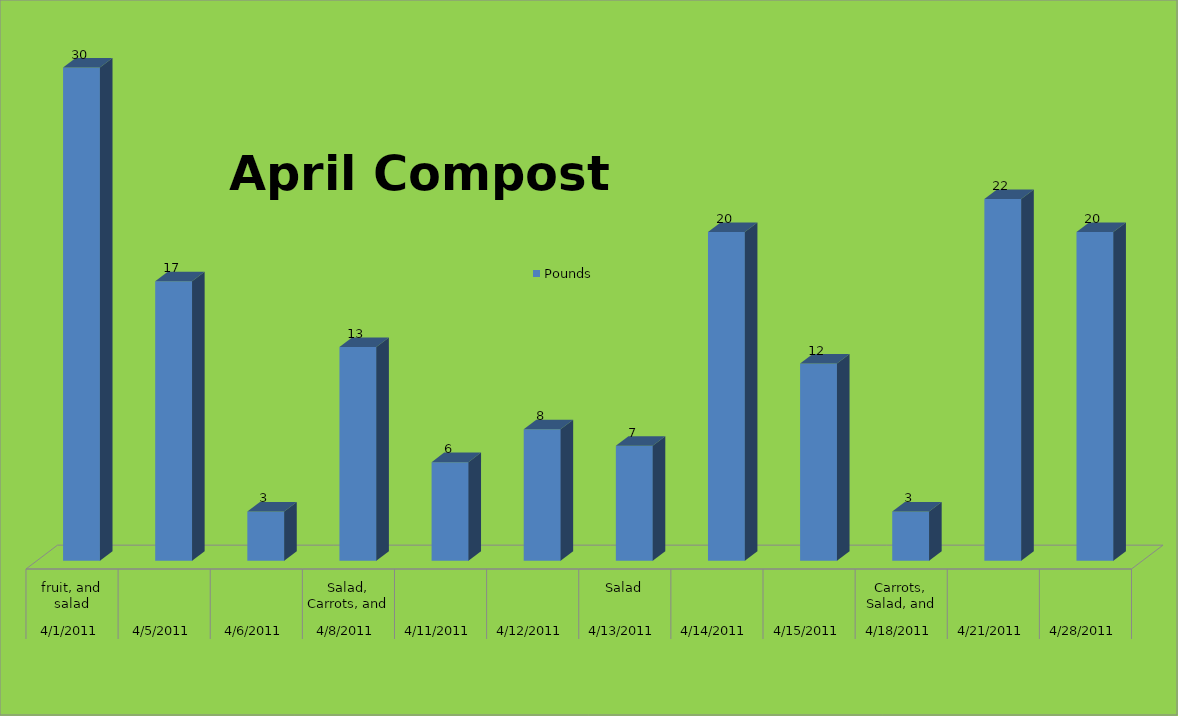
| Category | Pounds |
|---|---|
| 0 | 30 |
| 1 | 17 |
| 2 | 3 |
| 3 | 13 |
| 4 | 6 |
| 5 | 8 |
| 6 | 7 |
| 7 | 20 |
| 8 | 12 |
| 9 | 3 |
| 10 | 22 |
| 11 | 20 |